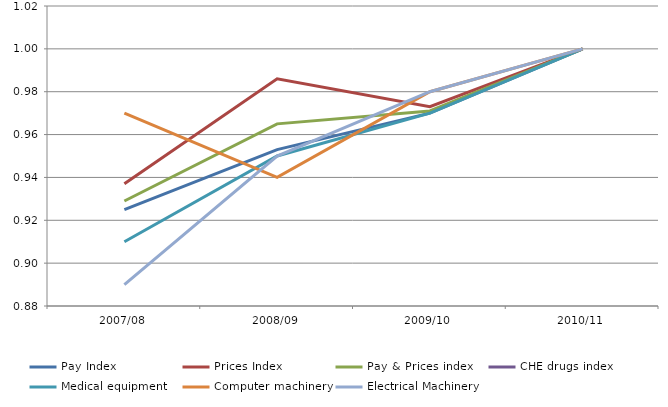
| Category | Pay Index | Prices Index | Pay & Prices index | CHE drugs index | Medical equipment  | Computer machinery | Electrical Machinery |
|---|---|---|---|---|---|---|---|
| 2007/08 | 0.925 | 0.937 | 0.929 |  | 0.91 | 0.97 | 0.89 |
| 2008/09 | 0.953 | 0.986 | 0.965 |  | 0.95 | 0.94 | 0.95 |
| 2009/10 | 0.97 | 0.973 | 0.971 |  | 0.97 | 0.98 | 0.98 |
| 2010/11 | 1 | 1 | 1 |  | 1 | 1 | 1 |